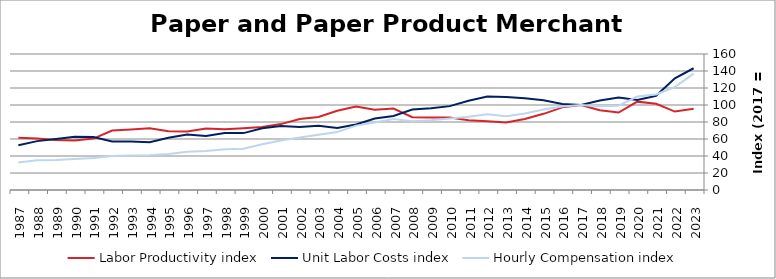
| Category | Labor Productivity index | Unit Labor Costs index | Hourly Compensation index |
|---|---|---|---|
| 2023.0 | 95.556 | 143.236 | 136.871 |
| 2022.0 | 92.244 | 131.353 | 121.166 |
| 2021.0 | 101.484 | 110.774 | 112.417 |
| 2020.0 | 103.958 | 105.908 | 110.099 |
| 2019.0 | 91.181 | 108.707 | 99.12 |
| 2018.0 | 93.773 | 105.223 | 98.67 |
| 2017.0 | 100 | 100 | 100 |
| 2016.0 | 97.201 | 101.153 | 98.322 |
| 2015.0 | 89.622 | 105.586 | 94.629 |
| 2014.0 | 83.526 | 107.897 | 90.122 |
| 2013.0 | 79.416 | 109.356 | 86.846 |
| 2012.0 | 80.951 | 110.063 | 89.097 |
| 2011.0 | 82.116 | 105.036 | 86.251 |
| 2010.0 | 85.375 | 98.675 | 84.244 |
| 2009.0 | 85.187 | 96.242 | 81.985 |
| 2008.0 | 85.646 | 94.596 | 81.017 |
| 2007.0 | 95.831 | 87.173 | 83.538 |
| 2006.0 | 94.548 | 84.033 | 79.451 |
| 2005.0 | 98.221 | 77.121 | 75.749 |
| 2004.0 | 93.311 | 72.996 | 68.113 |
| 2003.0 | 85.864 | 75.639 | 64.946 |
| 2002.0 | 83.49 | 73.998 | 61.781 |
| 2001.0 | 77.525 | 75.232 | 58.324 |
| 2000.0 | 74 | 72.624 | 53.742 |
| 1999.0 | 72.632 | 66.936 | 48.617 |
| 1998.0 | 71.58 | 67.042 | 47.989 |
| 1997.0 | 72.441 | 63.4 | 45.927 |
| 1996.0 | 68.873 | 65.371 | 45.023 |
| 1995.0 | 69.029 | 61.474 | 42.435 |
| 1994.0 | 72.676 | 56.15 | 40.808 |
| 1993.0 | 71.14 | 57.093 | 40.616 |
| 1992.0 | 70.018 | 57.058 | 39.951 |
| 1991.0 | 60.477 | 62.248 | 37.646 |
| 1990.0 | 58.349 | 62.637 | 36.548 |
| 1989.0 | 58.845 | 60.046 | 35.334 |
| 1988.0 | 60.647 | 57.503 | 34.874 |
| 1987.0 | 61.395 | 52.54 | 32.257 |